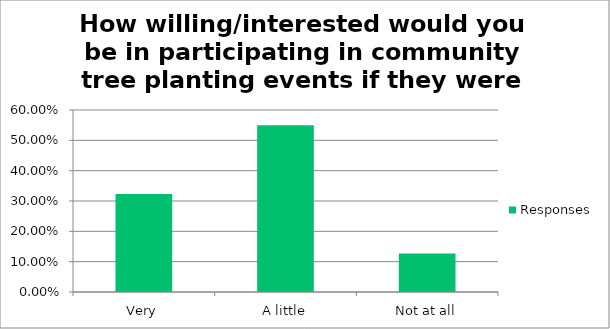
| Category | Responses |
|---|---|
| Very | 0.323 |
| A little | 0.55 |
| Not at all | 0.127 |